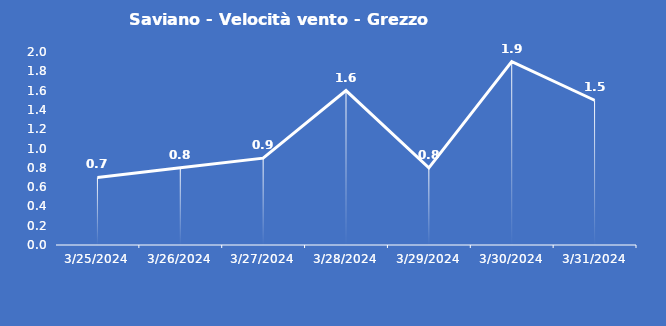
| Category | Saviano - Velocità vento - Grezzo (m/s) |
|---|---|
| 3/25/24 | 0.7 |
| 3/26/24 | 0.8 |
| 3/27/24 | 0.9 |
| 3/28/24 | 1.6 |
| 3/29/24 | 0.8 |
| 3/30/24 | 1.9 |
| 3/31/24 | 1.5 |